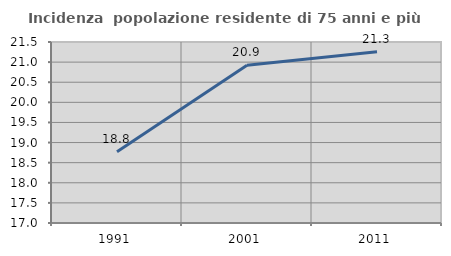
| Category | Incidenza  popolazione residente di 75 anni e più |
|---|---|
| 1991.0 | 18.774 |
| 2001.0 | 20.921 |
| 2011.0 | 21.256 |